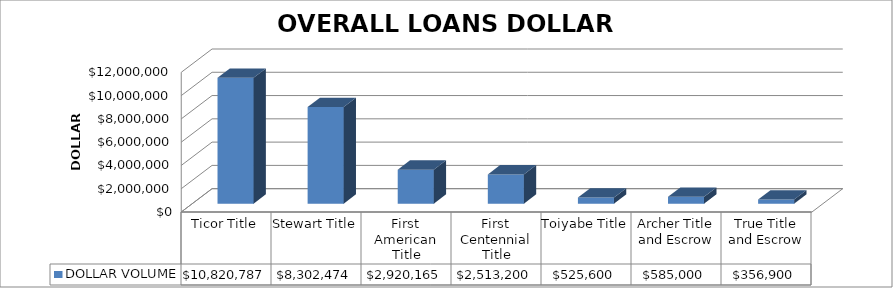
| Category | DOLLAR VOLUME |
|---|---|
| Ticor Title | 10820787 |
| Stewart Title | 8302474 |
| First American Title | 2920165 |
| First Centennial Title | 2513200 |
| Toiyabe Title | 525600 |
| Archer Title and Escrow | 585000 |
| True Title and Escrow | 356900 |